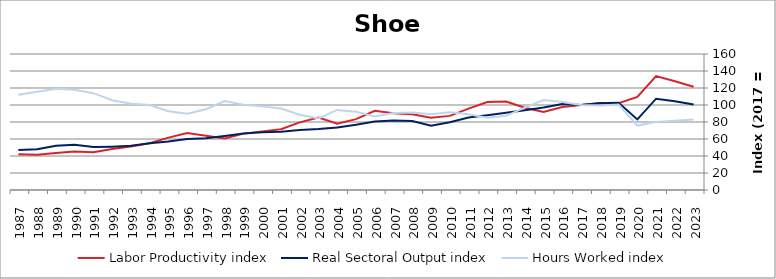
| Category | Labor Productivity index | Real Sectoral Output index | Hours Worked index |
|---|---|---|---|
| 2023.0 | 121.498 | 100.644 | 82.836 |
| 2022.0 | 128.007 | 104.3 | 81.48 |
| 2021.0 | 134.029 | 107.424 | 80.15 |
| 2020.0 | 109.569 | 83.019 | 75.769 |
| 2019.0 | 102.207 | 102.694 | 100.477 |
| 2018.0 | 102.462 | 101.981 | 99.531 |
| 2017.0 | 100 | 100 | 100 |
| 2016.0 | 97.638 | 101.175 | 103.623 |
| 2015.0 | 91.68 | 97.092 | 105.903 |
| 2014.0 | 96.843 | 93.883 | 96.943 |
| 2013.0 | 104.065 | 90.833 | 87.285 |
| 2012.0 | 103.552 | 88.053 | 85.033 |
| 2011.0 | 95.685 | 85.326 | 89.174 |
| 2010.0 | 87.193 | 79.821 | 91.545 |
| 2009.0 | 85.107 | 75.75 | 89.006 |
| 2008.0 | 89.121 | 81.234 | 91.15 |
| 2007.0 | 90.175 | 81.682 | 90.581 |
| 2006.0 | 93.088 | 80.454 | 86.428 |
| 2005.0 | 83.396 | 76.741 | 92.019 |
| 2004.0 | 78.089 | 73.559 | 94.199 |
| 2003.0 | 85.153 | 71.72 | 84.224 |
| 2002.0 | 79.583 | 70.447 | 88.52 |
| 2001.0 | 71.508 | 68.585 | 95.913 |
| 2000.0 | 68.976 | 67.86 | 98.382 |
| 1999.0 | 66.329 | 66.469 | 100.211 |
| 1998.0 | 60.733 | 63.582 | 104.691 |
| 1997.0 | 63.906 | 60.755 | 95.069 |
| 1996.0 | 67.036 | 60.071 | 89.609 |
| 1995.0 | 61.589 | 57.073 | 92.667 |
| 1994.0 | 55.054 | 55.026 | 99.949 |
| 1993.0 | 51.201 | 51.931 | 101.427 |
| 1992.0 | 48.326 | 51.021 | 105.577 |
| 1991.0 | 44.313 | 50.482 | 113.922 |
| 1990.0 | 45.206 | 53.282 | 117.864 |
| 1989.0 | 43.671 | 52.043 | 119.171 |
| 1988.0 | 41.562 | 48.064 | 115.645 |
| 1987.0 | 42.072 | 47.167 | 112.111 |